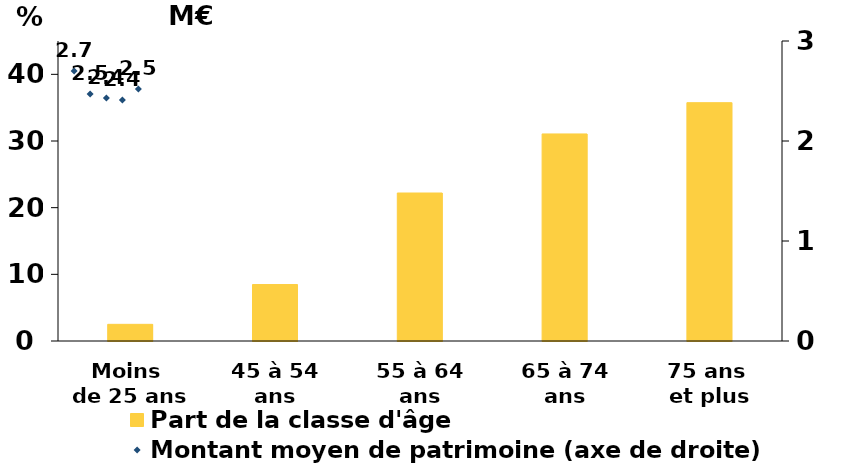
| Category | Part de la classe d'âge |
|---|---|
| Moins 
de 25 ans | 2.5 |
| 45 à 54 ans | 8.469 |
| 55 à 64 ans | 22.2 |
| 65 à 74 ans | 31.059 |
| 75 ans 
et plus | 35.748 |